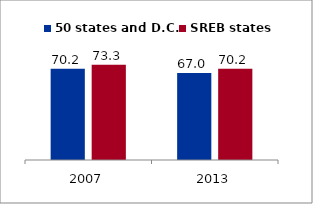
| Category | 50 states and D.C. | SREB states |
|---|---|---|
| 2007.0 | 70.195 | 73.263 |
| 2013.0 | 67.016 | 70.184 |